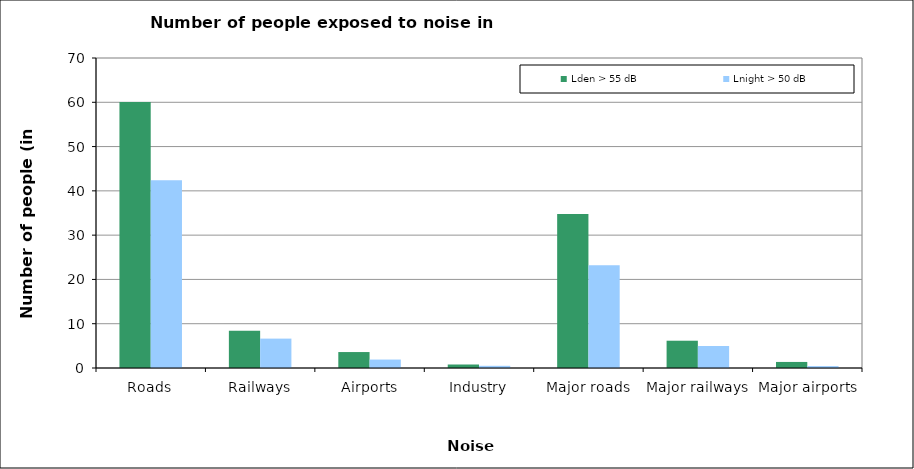
| Category | Lden > 55 dB | Lnight > 50 dB |
|---|---|---|
| Roads | 60051830 | 42399700 |
| Railways | 8395900 | 6637500 |
| Airports | 3601100 | 1908598 |
| Industry | 790500 | 495000 |
| Major roads | 34778540 | 23211685 |
| Major railways | 6161000 | 4969500 |
| Major airports | 1366800 | 434100 |